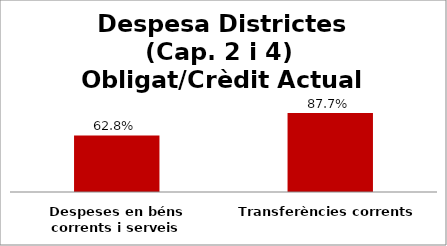
| Category | Series 0 |
|---|---|
| Despeses en béns corrents i serveis | 0.628 |
| Transferències corrents | 0.877 |